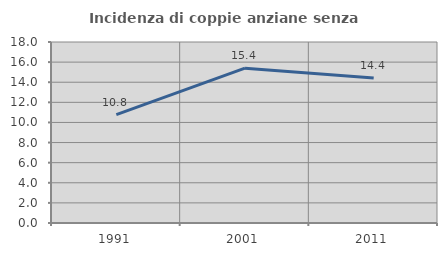
| Category | Incidenza di coppie anziane senza figli  |
|---|---|
| 1991.0 | 10.772 |
| 2001.0 | 15.397 |
| 2011.0 | 14.412 |